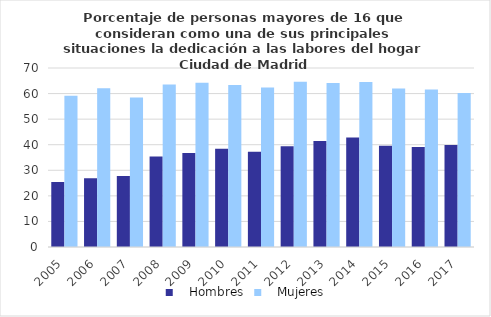
| Category |    Hombres |    Mujeres |
|---|---|---|
| 2005.0 | 25.4 | 59.103 |
| 2006.0 | 26.863 | 62.116 |
| 2007.0 | 27.808 | 58.424 |
| 2008.0 | 35.419 | 63.539 |
| 2009.0 | 36.765 | 64.266 |
| 2010.0 | 38.458 | 63.339 |
| 2011.0 | 37.212 | 62.351 |
| 2012.0 | 39.394 | 64.641 |
| 2013.0 | 41.41 | 64.176 |
| 2014.0 | 42.866 | 64.541 |
| 2015.0 | 39.609 | 61.944 |
| 2016.0 | 39.085 | 61.628 |
| 2017.0 | 39.86 | 60.206 |